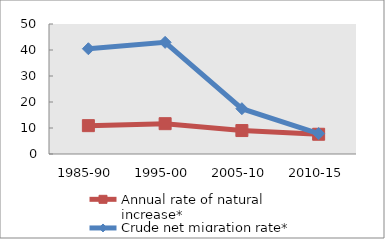
| Category | Annual rate of natural increase* | Crude net migration rate* |
|---|---|---|
| 1985-90 | 10.902 | 40.484 |
| 1995-00 | 11.663 | 42.935 |
| 2005-10 | 9.02 | 17.432 |
| 2010-15 | 7.593 | 7.849 |